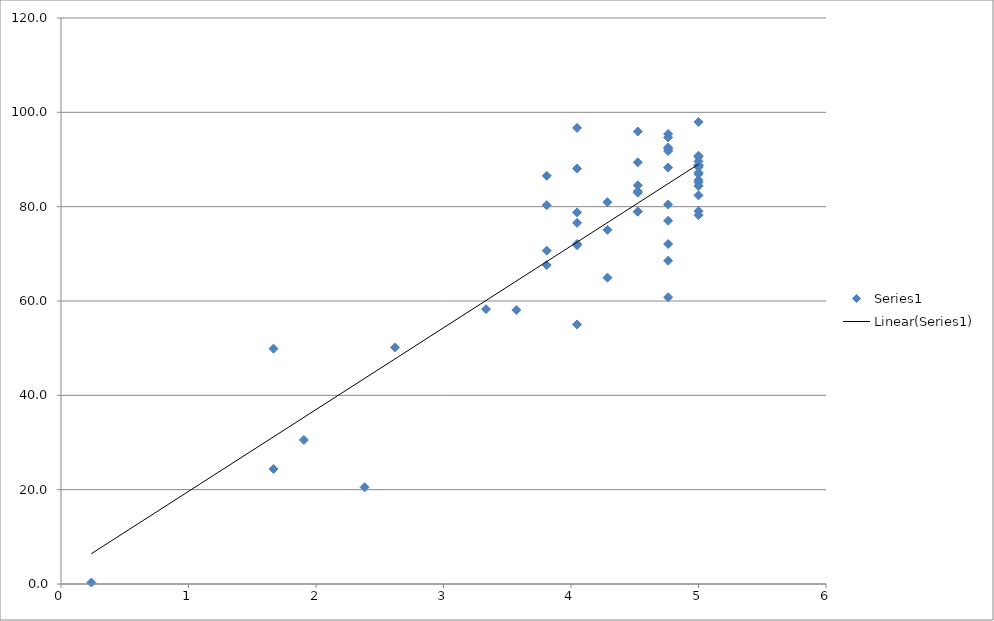
| Category | Series 0 |
|---|---|
| 5.0 | 88.367 |
| 5.0 | 97.967 |
| 5.0 | 90.567 |
| 4.0476190476190474 | 78.797 |
| 3.8095238095238093 | 67.613 |
| 4.761904761904762 | 68.549 |
| 4.761904761904762 | 80.449 |
| 4.523809523809524 | 78.932 |
| 2.619047619047619 | 50.159 |
| 5.0 | 89.6 |
| 5.0 | 85.633 |
| 4.285714285714286 | 64.948 |
| 4.761904761904762 | 92.549 |
| 1.6666666666666665 | 49.889 |
| 5.0 | 84.4 |
| 1.6666666666666665 | 24.389 |
| 4.523809523809524 | 89.398 |
| 5.0 | 84.4 |
| 4.285714285714286 | 75.081 |
| 4.0476190476190474 | 71.83 |
| 4.0476190476190474 | 96.697 |
| 4.523809523809524 | 82.965 |
| 4.523809523809524 | 83.265 |
| 5.0 | 78.2 |
| 3.333333333333333 | 58.278 |
| 5.0 | 85.167 |
| 4.761904761904762 | 88.283 |
| 4.523809523809524 | 95.932 |
| 3.8095238095238093 | 80.313 |
| 4.0476190476190474 | 88.097 |
| 5.0 | 88.733 |
| 1.9047619047619047 | 30.54 |
| 4.761904761904762 | 92.249 |
| 5.0 | 88.767 |
| 4.761904761904762 | 77.016 |
| 5.0 | 79.033 |
| 3.8095238095238093 | 70.679 |
| 4.761904761904762 | 94.683 |
| 4.523809523809524 | 78.965 |
| 4.285714285714286 | 80.948 |
| 4.0476190476190474 | 55.03 |
| 0.23809523809523808 | 0.317 |
| 2.380952380952381 | 20.508 |
| 5.0 | 86.9 |
| 5.0 | 88.767 |
| 5.0 | 90.8 |
| 4.761904761904762 | 72.083 |
| 4.761904761904762 | 91.783 |
| 3.8095238095238093 | 86.546 |
| 3.5714285714285716 | 58.095 |
| 4.523809523809524 | 84.532 |
| 5.0 | 87.233 |
| 4.761904761904762 | 60.816 |
| 5.0 | 82.4 |
| 4.0476190476190474 | 72.097 |
| 4.761904761904762 | 95.416 |
| 4.0476190476190474 | 76.563 |